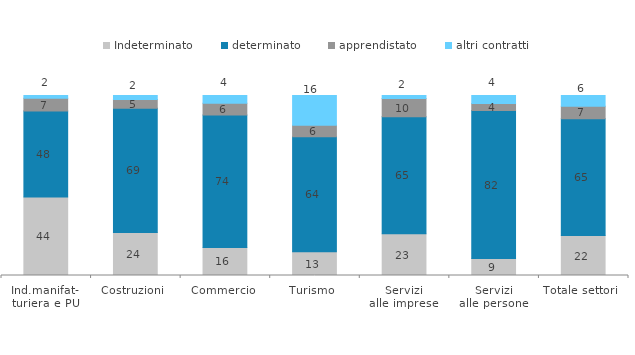
| Category | Indeterminato | determinato | apprendistato | altri contratti |
|---|---|---|---|---|
| Ind.manifat-
turiera e PU | 43.635 | 47.788 | 7.012 | 1.566 |
| Costruzioni | 23.954 | 69.011 | 4.753 | 2.281 |
| Commercio | 15.591 | 73.585 | 6.455 | 4.369 |
| Turismo | 13.164 | 63.898 | 6.441 | 16.497 |
| Servizi
alle imprese | 23.192 | 64.983 | 10.161 | 1.665 |
| Servizi
alle persone | 9.382 | 82.34 | 3.863 | 4.415 |
| Totale settori | 22.183 | 64.892 | 6.995 | 5.93 |